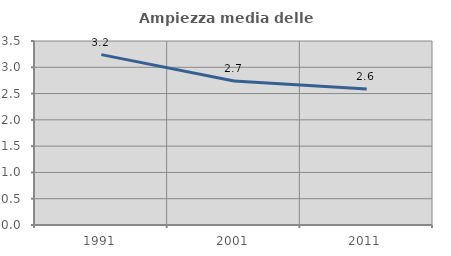
| Category | Ampiezza media delle famiglie |
|---|---|
| 1991.0 | 3.241 |
| 2001.0 | 2.74 |
| 2011.0 | 2.585 |